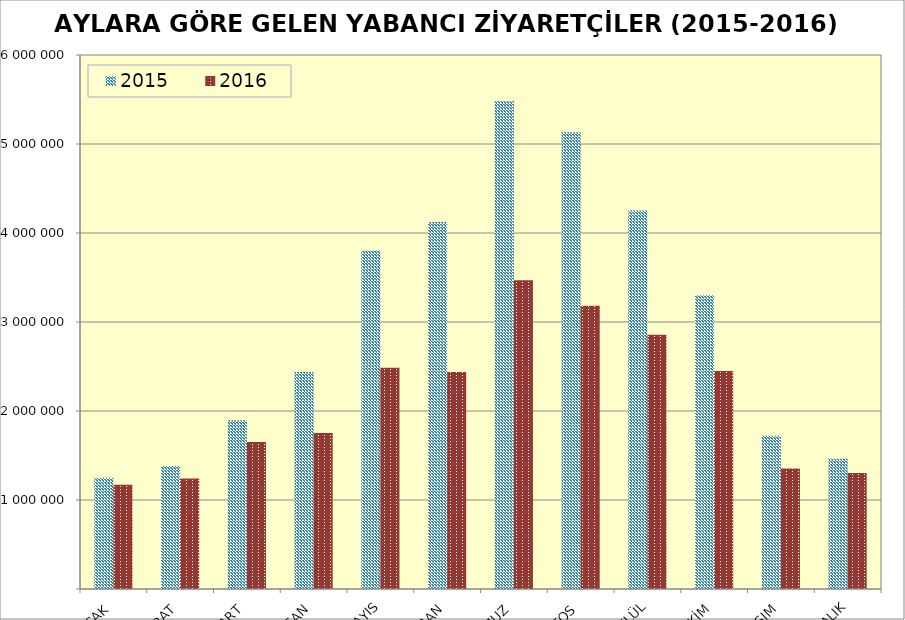
| Category | 2015 | 2016 |
|---|---|---|
| OCAK | 1250941 | 1170333 |
| ŞUBAT | 1383343 | 1240633 |
| MART | 1895940 | 1652511 |
| NİSAN | 2437263 | 1753045 |
| MAYIS | 3804158 | 2485411 |
| HAZİRAN | 4123109 | 2438293 |
| TEMMUZ | 5480502 | 3468202 |
| AĞUSTOS | 5130967 | 3183003 |
| EYLÜL | 4251870 | 2855397 |
| EKİM | 3301194 | 2449948 |
| KASIM | 1720554 | 1353280 |
| ARALIK | 1464791 | 1302157 |